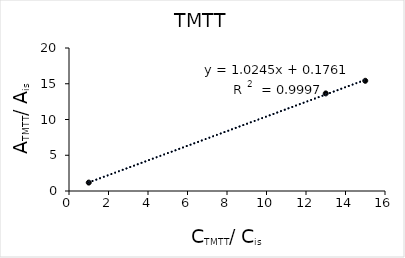
| Category | Series 0 |
|---|---|
| 1.0 | 1.179 |
| 13.0 | 13.646 |
| 15.0 | 15.412 |